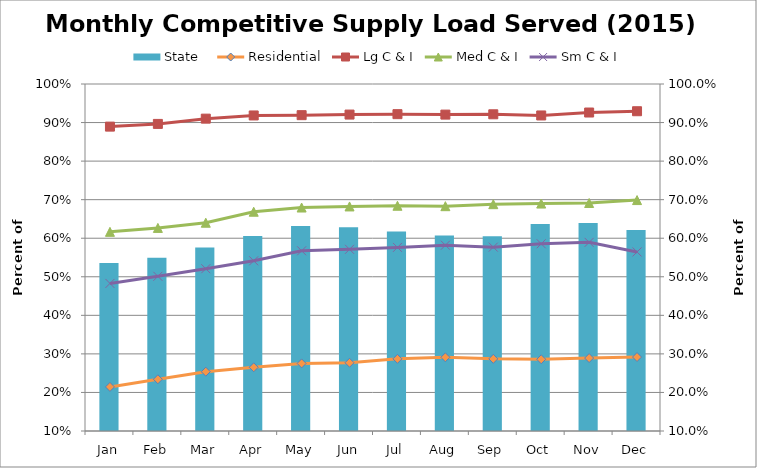
| Category | State   |
|---|---|
| Jan | 0.536 |
| Feb | 0.549 |
| Mar | 0.576 |
| Apr | 0.606 |
| May | 0.632 |
| Jun | 0.628 |
| Jul | 0.618 |
| Aug | 0.607 |
| Sep | 0.605 |
| Oct | 0.637 |
| Nov | 0.64 |
| Dec | 0.621 |